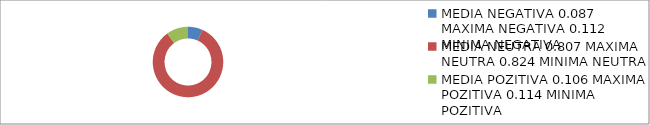
| Category | Series 0 | Series 1 |
|---|---|---|
| 0 | 0.064 |  |
| 1 | 0.79 |  |
| 2 | 0.095 |  |